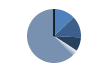
| Category | Series 0 |
|---|---|
| ARRASTRE | 111 |
| CERCO | 111 |
| PALANGRE | 71 |
| REDES DE ENMALLE | 15 |
| ARTES FIJAS | 13 |
| ARTES MENORES | 538 |
| SIN TIPO ASIGNADO | 0 |